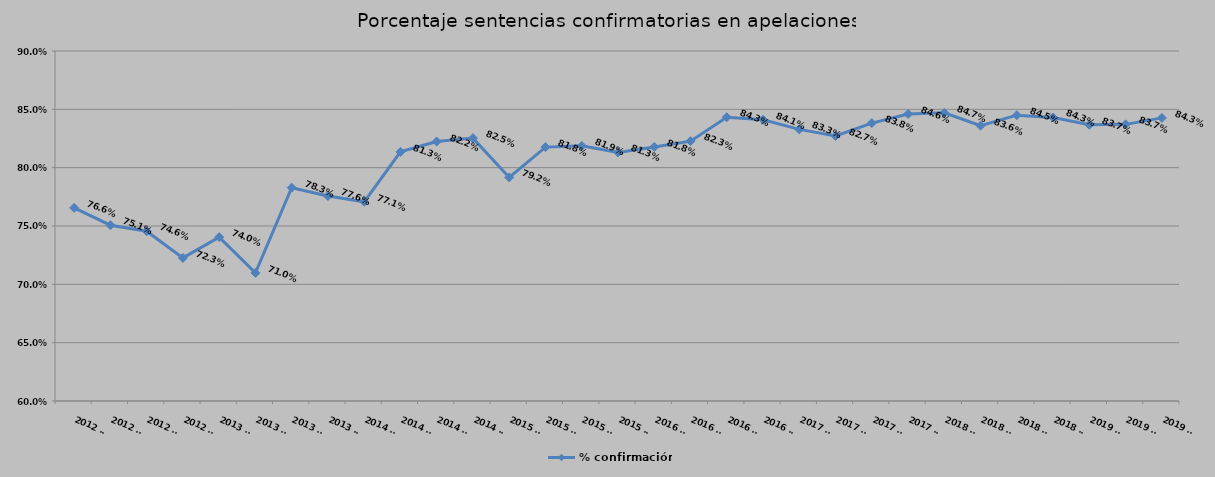
| Category | % confirmación |
|---|---|
| 2012 T1 | 0.766 |
| 2012 T2 | 0.751 |
| 2012 T3 | 0.746 |
| 2012 T4 | 0.723 |
| 2013 T1 | 0.74 |
| 2013 T2 | 0.71 |
| 2013 T3 | 0.783 |
| 2013 T4 | 0.776 |
| 2014 T1 | 0.771 |
| 2014 T2 | 0.813 |
| 2014 T3 | 0.822 |
| 2014 T4 | 0.825 |
| 2015 T1 | 0.792 |
| 2015 T2 | 0.818 |
| 2015 T3 | 0.819 |
| 2015 T4 | 0.813 |
| 2016 T1 | 0.818 |
| 2016 T2 | 0.823 |
| 2016 T3 | 0.843 |
| 2016 T4 | 0.841 |
| 2017 T1 | 0.833 |
| 2017 T2 | 0.827 |
| 2017 T3 | 0.838 |
| 2017 T4 | 0.846 |
| 2018 T1 | 0.847 |
| 2018 T2 | 0.836 |
| 2018 T3 | 0.845 |
| 2018 T4 | 0.843 |
| 2019 T1 | 0.837 |
| 2019 T2 | 0.837 |
| 2019 T3 | 0.843 |